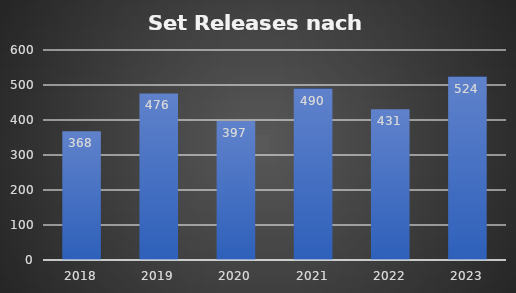
| Category | Sets |
|---|---|
| 2018.0 | 368 |
| 2019.0 | 476 |
| 2020.0 | 397 |
| 2021.0 | 490 |
| 2022.0 | 431 |
| 2023.0 | 524 |